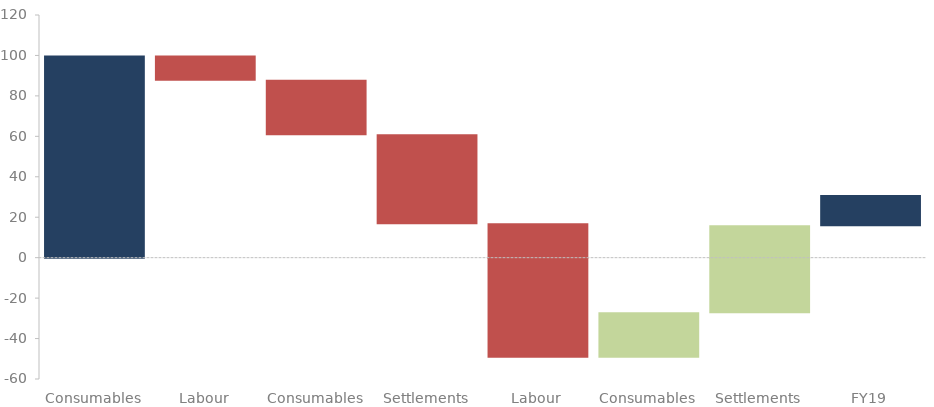
| Category | Series 0 | Series 1 | Series 2 |
|---|---|---|---|
| Consumables | 0 | 100 | 0 |
| Labour | 88 | 12 | 0 |
| Consumables | 61 | 27 | 0 |
| Settlements | 17 | 44 | 0 |
| Labour | 0 | -49 | 17 |
| Consumables | -27 | -22 | 0 |
| Settlements | 0 | 16 | -27 |
| FY19 | 16 | 15 | 0 |